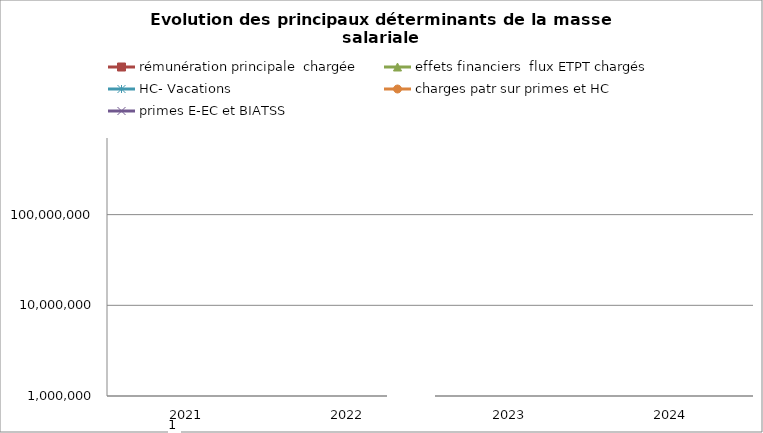
| Category | rémunération principale  chargée | effets financiers  flux ETPT chargés | HC- Vacations | charges patr sur primes et HC | primes E-EC et BIATSS |
|---|---|---|---|---|---|
| 2021.0 | 0 | 1 | 0 | 0 | 0 |
| 2022.0 | 0 | 0 | 0 | 0 | 0 |
| 2023.0 | 0 | 0 | 0 | 0 | 0 |
| 2024.0 | 0 | 0 | 0 | 0 | 0 |